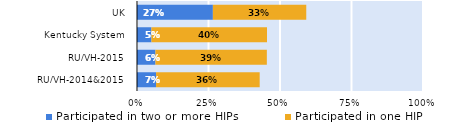
| Category | Participated in two or more HIPs | Participated in one HIP |
|---|---|---|
| RU/VH-2014&2015 | 0.067 | 0.362 |
| RU/VH-2015 | 0.064 | 0.39 |
| Kentucky System | 0.051 | 0.404 |
| UK | 0.265 | 0.327 |